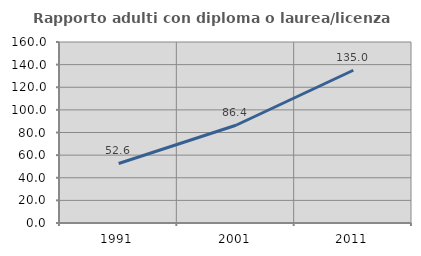
| Category | Rapporto adulti con diploma o laurea/licenza media  |
|---|---|
| 1991.0 | 52.605 |
| 2001.0 | 86.401 |
| 2011.0 | 135.039 |